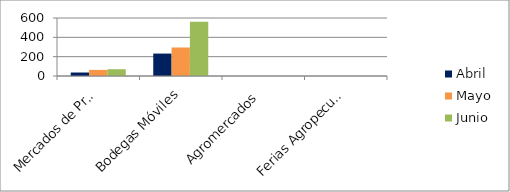
| Category | Abril | Mayo | Junio |
|---|---|---|---|
| Mercados de Productores | 36 | 63 | 70 |
| Bodegas Móviles | 232 | 295 | 561 |
| Agromercados | 0 | 0 | 0 |
| Ferias Agropecuarias | 0 | 0 | 0 |